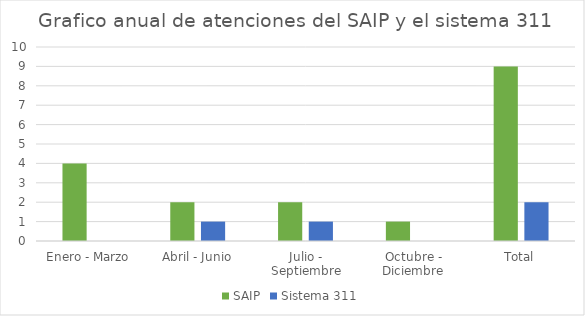
| Category | SAIP | Sistema 311 |
|---|---|---|
| Enero - Marzo | 4 | 0 |
| Abril - Junio | 2 | 1 |
| Julio - Septiembre | 2 | 1 |
| Octubre - Diciembre | 1 | 0 |
| Total | 9 | 2 |